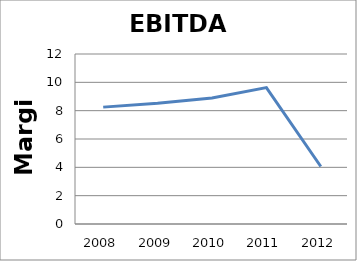
| Category | Series 0 |
|---|---|
| 2008.0 | 8.25 |
| 2009.0 | 8.53 |
| 2010.0 | 8.9 |
| 2011.0 | 9.63 |
| 2012.0 | 4.06 |